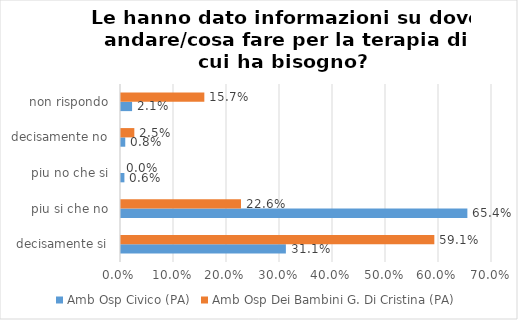
| Category | Amb Osp Civico (PA) | Amb Osp Dei Bambini G. Di Cristina (PA) |
|---|---|---|
| decisamente si | 0.311 | 0.591 |
| piu si che no | 0.654 | 0.226 |
| piu no che si | 0.006 | 0 |
| decisamente no | 0.008 | 0.025 |
| non rispondo | 0.021 | 0.157 |